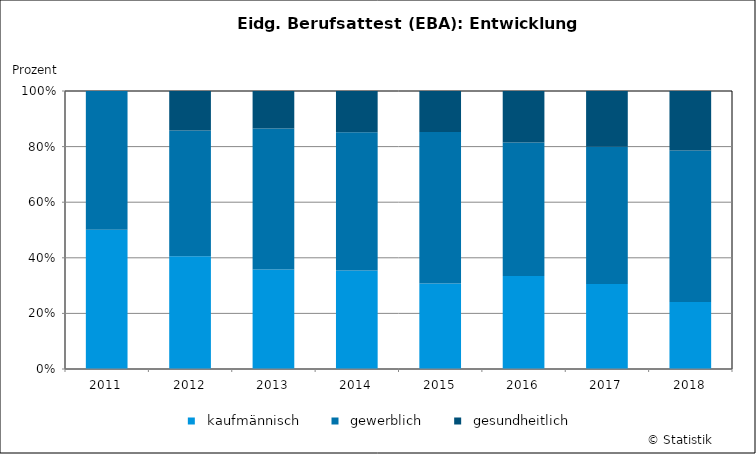
| Category |   kaufmännisch |   gewerblich |   gesundheitlich |
|---|---|---|---|
| 2011 | 187 | 186 | 0 |
| 2012 | 165 | 184 | 58 |
| 2013 | 149 | 211 | 56 |
| 2014 | 172 | 242 | 72 |
| 2015 | 150 | 266 | 72 |
| 2016 | 177 | 254 | 98 |
| 2017 | 168 | 271 | 110 |
| 2018 | 124 | 280 | 110 |